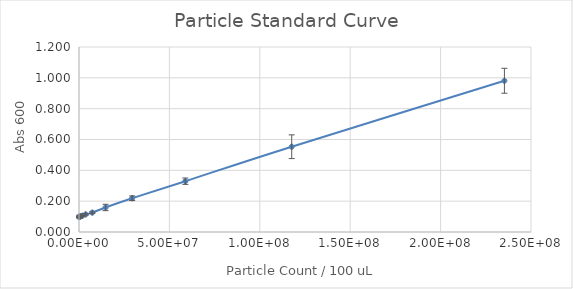
| Category | Series 0 |
|---|---|
| 235294117.64705887 | 0.981 |
| 117647058.82352944 | 0.553 |
| 58823529.41176472 | 0.33 |
| 29411764.70588236 | 0.219 |
| 14705882.35294118 | 0.159 |
| 7352941.17647059 | 0.126 |
| 3676470.588235295 | 0.114 |
| 1838235.2941176475 | 0.105 |
| 919117.6470588237 | 0.103 |
| 459558.82352941186 | 0.098 |
| 229779.41176470593 | 0.1 |
| 0.0 | 0.098 |